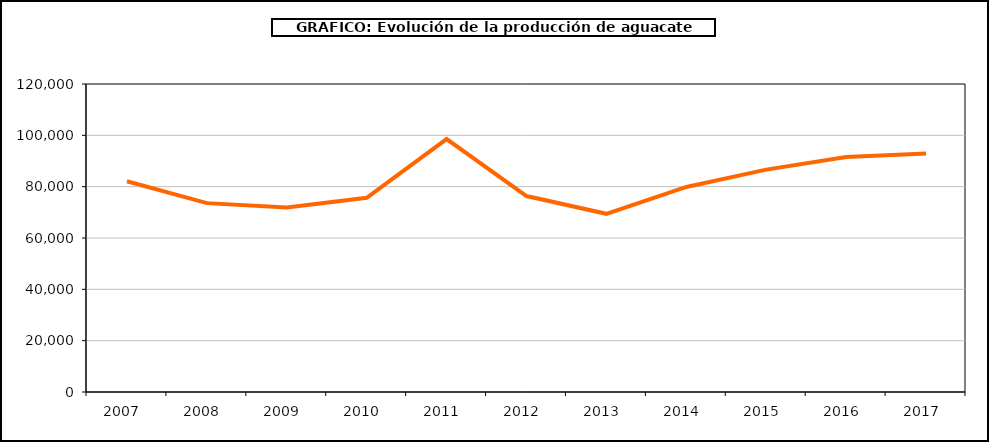
| Category | producción aguacate |
|---|---|
| 2007.0 | 82116 |
| 2008.0 | 73585 |
| 2009.0 | 71931 |
| 2010.0 | 75655 |
| 2011.0 | 98535 |
| 2012.0 | 76337 |
| 2013.0 | 69427 |
| 2014.0 | 79886 |
| 2015.0 | 86636 |
| 2016.0 | 91530 |
| 2017.0 | 92936 |